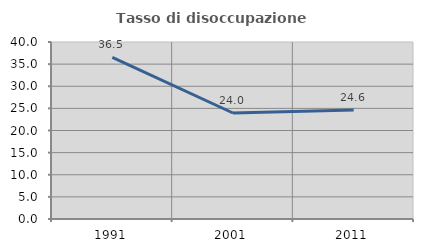
| Category | Tasso di disoccupazione giovanile  |
|---|---|
| 1991.0 | 36.508 |
| 2001.0 | 23.954 |
| 2011.0 | 24.638 |